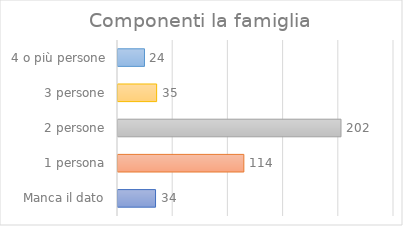
| Category | Componenti la famiglia |
|---|---|
| Manca il dato | 34 |
| 1 persona | 114 |
| 2 persone | 202 |
| 3 persone | 35 |
| 4 o più persone | 24 |